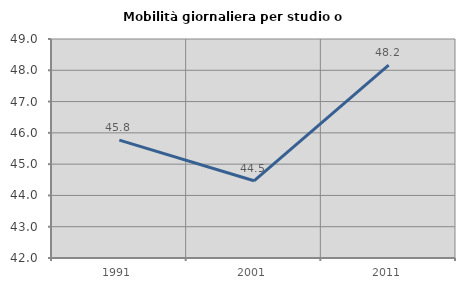
| Category | Mobilità giornaliera per studio o lavoro |
|---|---|
| 1991.0 | 45.769 |
| 2001.0 | 44.468 |
| 2011.0 | 48.164 |